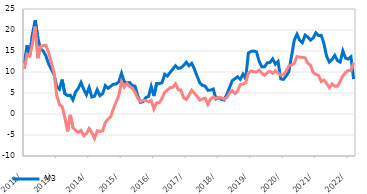
| Category | M3  | Домаћи кредити немонетарном сектору |
|---|---|---|
| 2012-01-01 | 12.01 | 10.729 |
| 2012-02-01 | 16.354 | 14.221 |
| 2012-03-01 | 13.992 | 13.782 |
| 2012-04-01 | 18.952 | 16.69 |
| 2012-05-01 | 22.329 | 20.823 |
| 2012-06-01 | 18.134 | 13.296 |
| 2012-07-01 | 15.507 | 16.043 |
| 2012-08-01 | 15.015 | 16.313 |
| 2012-09-01 | 13.837 | 16.292 |
| 2012-10-01 | 11.912 | 14.641 |
| 2012-11-01 | 10.629 | 12.241 |
| 2012-12-01 | 9.421 | 9.834 |
| 2013-01-01 | 6.554 | 4.448 |
| 2013-02-01 | 5.916 | 2.211 |
| 2013-03-01 | 8.196 | 1.791 |
| 2013-04-01 | 4.809 | -0.816 |
| 2013-05-01 | 4.39 | -4.149 |
| 2013-06-01 | 4.482 | -0.203 |
| 2013-07-01 | 3.358 | -3.232 |
| 2013-08-01 | 5.277 | -3.913 |
| 2013-09-01 | 6.108 | -4.338 |
| 2013-10-01 | 7.502 | -3.897 |
| 2013-11-01 | 5.896 | -5.181 |
| 2013-12-01 | 4.573 | -4.65 |
| 2014-01-01 | 6.313 | -3.453 |
| 2014-02-01 | 4.038 | -4.43 |
| 2014-03-01 | 4.234 | -5.804 |
| 2014-04-01 | 5.797 | -3.993 |
| 2014-05-01 | 4.358 | -4.149 |
| 2014-06-01 | 4.845 | -4.035 |
| 2014-07-01 | 6.767 | -2.016 |
| 2014-08-01 | 6.108 | -1.198 |
| 2014-09-01 | 6.605 | -0.64 |
| 2014-10-01 | 7.075 | 1.254 |
| 2014-11-01 | 7.143 | 2.875 |
| 2014-12-01 | 7.648 | 4.423 |
| 2015-01-01 | 9.694 | 7.684 |
| 2015-02-01 | 7.639 | 6.418 |
| 2015-03-01 | 7.404 | 7.278 |
| 2015-04-01 | 7.508 | 6.557 |
| 2015-05-01 | 6.749 | 6.196 |
| 2015-06-01 | 6.629 | 5.14 |
| 2015-07-01 | 4.381 | 3.777 |
| 2015-08-01 | 2.769 | 2.956 |
| 2015-09-01 | 2.936 | 3.226 |
| 2015-10-01 | 3.902 | 3.199 |
| 2015-11-01 | 4.175 | 2.893 |
| 2015-12-01 | 6.564 | 3.196 |
| 2016-01-01 | 4.278 | 1.199 |
| 2016-02-01 | 7.267 | 2.638 |
| 2016-03-01 | 7.218 | 2.687 |
| 2016-04-01 | 7.458 | 3.711 |
| 2016-05-01 | 9.45 | 5.171 |
| 2016-06-01 | 9.03 | 5.69 |
| 2016-07-01 | 9.881 | 6.257 |
| 2016-08-01 | 10.715 | 6.355 |
| 2016-09-01 | 11.496 | 7.196 |
| 2016-10-01 | 10.853 | 5.785 |
| 2016-11-01 | 11.002 | 5.691 |
| 2016-12-01 | 11.553 | 3.906 |
| 2017-01-01 | 12.319 | 3.475 |
| 2017-02-01 | 11.489 | 4.47 |
| 2017-03-01 | 12.067 | 5.654 |
| 2017-04-01 | 10.696 | 4.923 |
| 2017-05-01 | 9.013 | 4.221 |
| 2017-06-01 | 7.423 | 3.312 |
| 2017-07-01 | 6.807 | 3.565 |
| 2017-08-01 | 6.642 | 3.755 |
| 2017-09-01 | 5.632 | 2.278 |
| 2017-10-01 | 5.691 | 3.574 |
| 2017-11-01 | 5.952 | 4.092 |
| 2017-12-01 | 3.567 | 3.671 |
| 2018-01-01 | 3.888 | 3.977 |
| 2018-02-01 | 3.511 | 3.859 |
| 2018-03-01 | 3.318 | 3.502 |
| 2018-04-01 | 4.689 | 3.934 |
| 2018-05-01 | 6.249 | 5.016 |
| 2018-06-01 | 7.929 | 5.586 |
| 2018-07-01 | 8.383 | 4.847 |
| 2018-08-01 | 8.861 | 5.412 |
| 2018-09-01 | 8.24 | 7.016 |
| 2018-10-31 | 9.483 | 7.163 |
| 2018-11-30 | 8.409 | 7.417 |
| 2018-12-31 | 14.522 | 9.795 |
| 2019-01-31 | 14.909 | 10.252 |
| 2019-02-28 | 15.018 | 10.086 |
| 2019-03-31 | 14.797 | 9.982 |
| 2019-04-30 | 12.506 | 10.464 |
| 2019-05-31 | 11.216 | 9.694 |
| 2019-06-30 | 11.23 | 9.224 |
| 2019-07-31 | 12.186 | 9.826 |
| 2019-08-31 | 12.279 | 10.177 |
| 2019-09-30 | 13.127 | 9.697 |
| 2019-10-31 | 11.864 | 10.311 |
| 2019-11-30 | 12.513 | 9.755 |
| 2019-12-31 | 8.354 | 9.245 |
| 2020-01-31 | 8.237 | 9.334 |
| 2020-02-29 | 9.035 | 10.229 |
| 2020-03-31 | 10.113 | 11.424 |
| 2020-04-30 | 13.811 | 11.641 |
| 2020-05-31 | 17.557 | 12.071 |
| 2020-06-30 | 18.995 | 13.679 |
| 2020-07-31 | 17.552 | 13.526 |
| 2020-08-31 | 16.965 | 13.505 |
| 2020-09-30 | 18.779 | 13.379 |
| 2020-10-31 | 18.356 | 12.108 |
| 2020-11-30 | 17.578 | 11.663 |
| 2020-12-31 | 18.105 | 9.901 |
| 2021-01-31 | 19.323 | 9.428 |
| 2021-02-28 | 18.702 | 9.17 |
| 2021-03-31 | 18.724 | 7.735 |
| 2021-04-30 | 16.749 | 8.079 |
| 2021-05-31 | 13.689 | 7.279 |
| 2021-06-30 | 12.386 | 6.275 |
| 2021-07-31 | 12.98 | 7.175 |
| 2021-08-31 | 13.971 | 6.618 |
| 2021-09-30 | 12.717 | 6.585 |
| 2021-10-31 | 12.354 | 7.764 |
| 2021-11-30 | 15.024 | 9.049 |
| 2021-12-31 | 13.293 | 9.904 |
| 2022-01-31 | 13.088 | 10.364 |
| 2022-02-28 | 13.628 | 10.35 |
| 2022-03-31 | 8.323 | 12.2 |